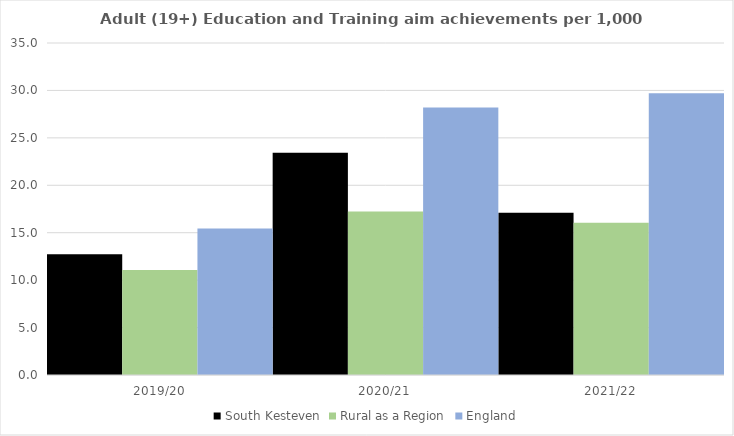
| Category | South Kesteven | Rural as a Region | England |
|---|---|---|---|
| 2019/20 | 12.728 | 11.081 | 15.446 |
| 2020/21 | 23.438 | 17.224 | 28.211 |
| 2021/22 | 17.106 | 16.063 | 29.711 |